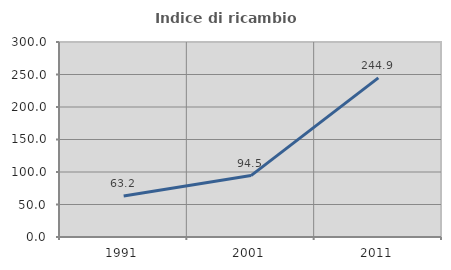
| Category | Indice di ricambio occupazionale  |
|---|---|
| 1991.0 | 63.194 |
| 2001.0 | 94.486 |
| 2011.0 | 244.898 |